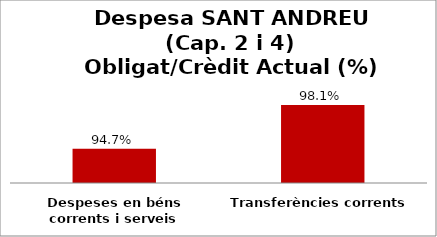
| Category | Series 0 |
|---|---|
| Despeses en béns corrents i serveis | 0.947 |
| Transferències corrents | 0.981 |